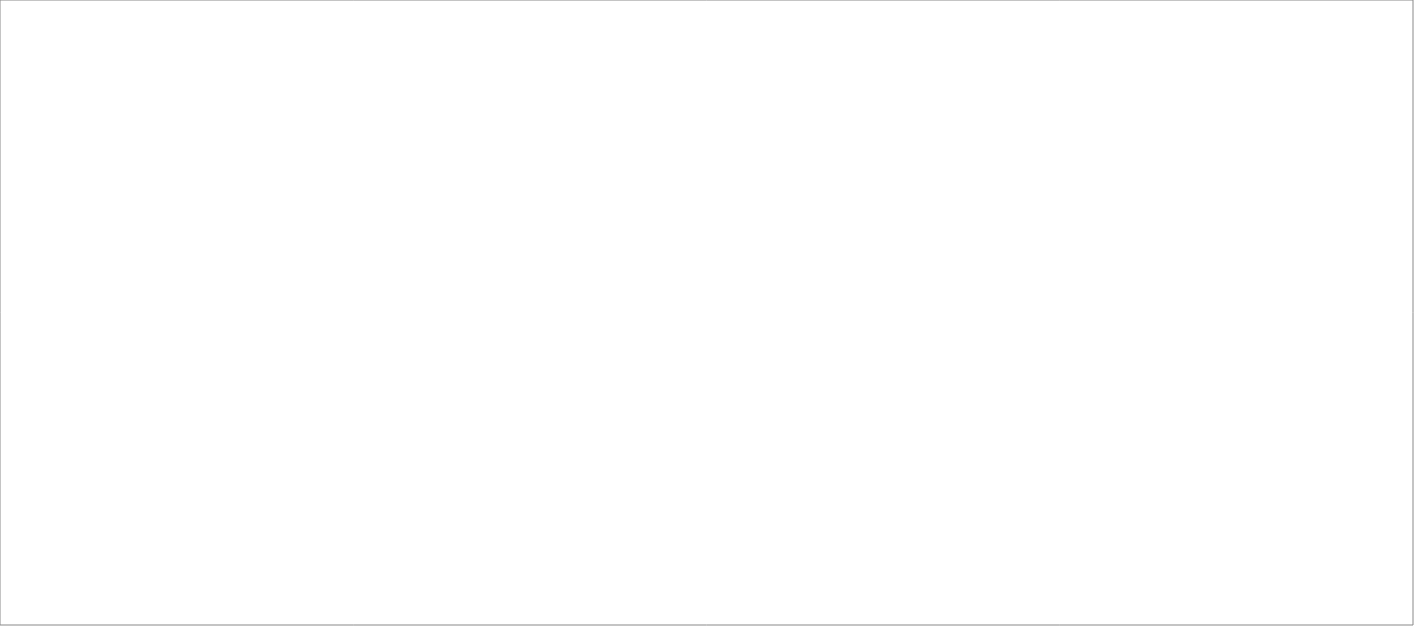
| Category | Total |
|---|---|
| Poolia Sverige AB | 85 |
| Wise Professionals AB | 65 |
| Experis AB | 45 |
| Lisberg Sverige AB | 25 |
| Source Executive Recruitment Sweden AB | 25 |